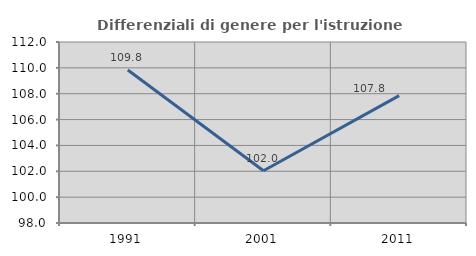
| Category | Differenziali di genere per l'istruzione superiore |
|---|---|
| 1991.0 | 109.832 |
| 2001.0 | 102.038 |
| 2011.0 | 107.849 |